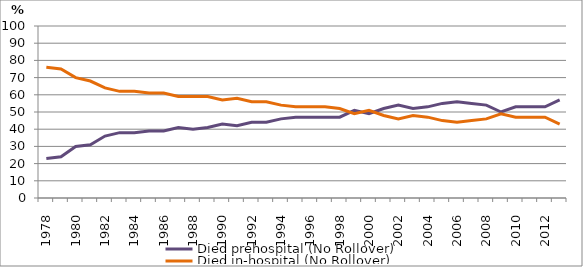
| Category | Died prehospital (No Rollover) | Died in-hospital (No Rollover) |
|---|---|---|
| 1978.0 | 23 | 76 |
| 1979.0 | 24 | 75 |
| 1980.0 | 30 | 70 |
| 1981.0 | 31 | 68 |
| 1982.0 | 36 | 64 |
| 1983.0 | 38 | 62 |
| 1984.0 | 38 | 62 |
| 1985.0 | 39 | 61 |
| 1986.0 | 39 | 61 |
| 1987.0 | 41 | 59 |
| 1988.0 | 40 | 59 |
| 1989.0 | 41 | 59 |
| 1990.0 | 43 | 57 |
| 1991.0 | 42 | 58 |
| 1992.0 | 44 | 56 |
| 1993.0 | 44 | 56 |
| 1994.0 | 46 | 54 |
| 1995.0 | 47 | 53 |
| 1996.0 | 47 | 53 |
| 1997.0 | 47 | 53 |
| 1998.0 | 47 | 52 |
| 1999.0 | 51 | 49 |
| 2000.0 | 49 | 51 |
| 2001.0 | 52 | 48 |
| 2002.0 | 54 | 46 |
| 2003.0 | 52 | 48 |
| 2004.0 | 53 | 47 |
| 2005.0 | 55 | 45 |
| 2006.0 | 56 | 44 |
| 2007.0 | 55 | 45 |
| 2008.0 | 54 | 46 |
| 2009.0 | 50 | 49 |
| 2010.0 | 53 | 47 |
| 2011.0 | 53 | 47 |
| 2012.0 | 53 | 47 |
| 2013.0 | 57 | 43 |